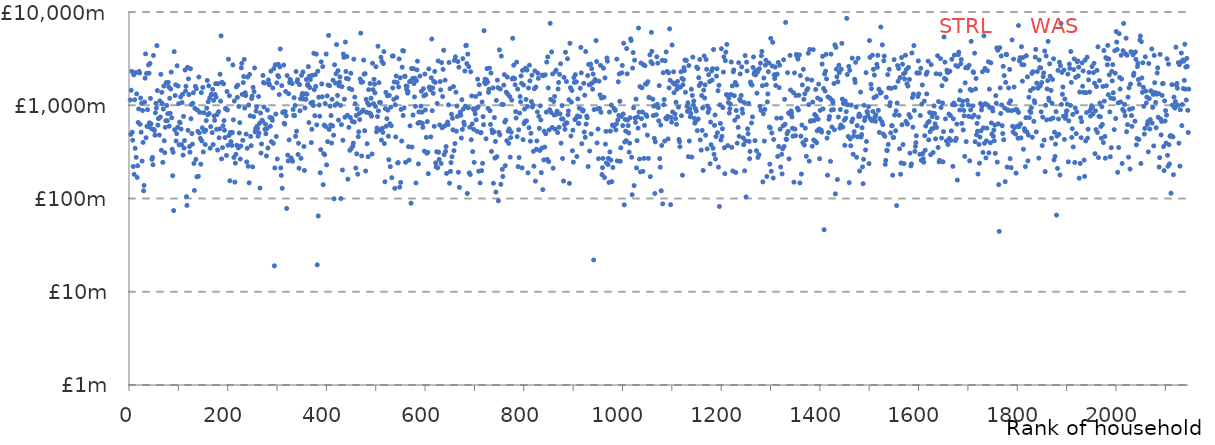
| Category | STRL | WAS |
|---|---|---|
| 0.0 |  | 1138437430.29 |
| 1.0 |  | 488014633.885 |
| 2.0 |  | 1448826612.328 |
| 3.0 |  | 2305919310.573 |
| 4.0 |  | 514027595.297 |
| 5.0 |  | 421928684.106 |
| 6.0 |  | 220240159.911 |
| 7.0 |  | 2116399411.006 |
| 8.0 |  | 181622341.76 |
| 9.0 |  | 1145670837.072 |
| 10.0 |  | 345169902.161 |
| 11.0 |  | 2240864981.197 |
| 12.0 |  | 276567388.786 |
| 13.0 |  | 1325935301.477 |
| 14.0 |  | 168146934.232 |
| 15.0 |  | 224537768.481 |
| 16.0 |  | 653219301.316 |
| 17.0 |  | 913499389.163 |
| 18.0 |  | 2303847512.39 |
| 19.0 |  | 2217212719.335 |
| 20.0 |  | 624051426.238 |
| 21.0 |  | 1192732653.997 |
| 22.0 |  | 513810169.82 |
| 23.0 |  | 1047870891.075 |
| 24.0 |  | 252179571.347 |
| 25.0 |  | 878187423.019 |
| 26.0 |  | 399446822.946 |
| 27.0 |  | 120925428.129 |
| 28.0 |  | 138160874.767 |
| 29.0 |  | 1081704356.472 |
| 30.0 |  | 1952691991.49 |
| 31.0 |  | 3556398857.896 |
| 32.0 |  | 448155769.203 |
| 33.0 |  | 2195711598.5 |
| 34.0 |  | 595310327.949 |
| 35.0 |  | 896296576.971 |
| 36.0 |  | 590604884.512 |
| 37.0 |  | 2706248038.967 |
| 38.0 |  | 2208458869.35 |
| 39.0 |  | 648886711.553 |
| 40.0 |  | 2807338901.922 |
| 41.0 |  | 1184371192.693 |
| 42.0 |  | 630289568.81 |
| 43.0 |  | 559363821.453 |
| 44.0 |  | 262675184.141 |
| 45.0 |  | 275894700.394 |
| 46.0 |  | 230326553.145 |
| 47.0 |  | 3417549013.854 |
| 48.0 |  | 550744215.51 |
| 49.0 |  | 534445831.798 |
| 50.0 |  | 476666595.493 |
| 51.0 |  | 830566759.252 |
| 52.0 |  | 1048224853.004 |
| 53.0 |  | 932991745.357 |
| 54.0 |  | 4364192513.168 |
| 55.0 |  | 1439233717.121 |
| 56.0 |  | 611663312.844 |
| 57.0 |  | 721103057.419 |
| 58.0 |  | 723775554.198 |
| 59.0 |  | 479216681.565 |
| 60.0 |  | 1111629381.253 |
| 61.0 |  | 748116808.675 |
| 62.0 |  | 2146440523.926 |
| 63.0 |  | 329113371.218 |
| 64.0 |  | 1375600072.342 |
| 65.0 |  | 1043769313.125 |
| 66.0 |  | 244071180.721 |
| 67.0 |  | 911268242.576 |
| 68.0 |  | 1606861998.141 |
| 69.0 |  | 416622515.235 |
| 70.0 |  | 309992068.999 |
| 71.0 |  | 579157128.555 |
| 72.0 |  | 681763382.086 |
| 73.0 |  | 1751672372.845 |
| 74.0 |  | 995910166.346 |
| 75.0 |  | 683096596.186 |
| 76.0 |  | 812302875.21 |
| 77.0 |  | 1759127460.007 |
| 78.0 |  | 1575134979.018 |
| 79.0 |  | 596542022.505 |
| 80.0 |  | 1187492341.537 |
| 81.0 |  | 819308674.487 |
| 82.0 |  | 1494839889.771 |
| 83.0 |  | 2268658745.334 |
| 84.0 |  | 733955685.854 |
| 85.0 |  | 337135531.644 |
| 86.0 |  | 175395398.296 |
| 87.0 |  | 312849575.472 |
| 88.0 |  | 74255529.425 |
| 89.0 |  | 3758127083.645 |
| 90.0 |  | 546877584.516 |
| 91.0 |  | 1271004133.935 |
| 92.0 |  | 1657193591.138 |
| 93.0 |  | 414153955.02 |
| 94.0 |  | 495758775.234 |
| 95.0 |  | 2654909426.39 |
| 96.0 |  | 580740136.614 |
| 97.0 |  | 1606807465.726 |
| 98.0 |  | 1040152650.778 |
| 99.0 |  | 375589400.904 |
| 100.0 |  | 659191072.102 |
| 101.0 |  | 648374185.305 |
| 102.0 |  | 1227815704.731 |
| 103.0 |  | 554798227.373 |
| 104.0 |  | 378514457.324 |
| 105.0 |  | 1070044495.781 |
| 106.0 |  | 1308139949.58 |
| 107.0 |  | 291978021.099 |
| 108.0 |  | 760363974.818 |
| 109.0 |  | 347344098.44 |
| 110.0 |  | 418619805.849 |
| 111.0 |  | 2389742231.942 |
| 112.0 |  | 1417070627.277 |
| 113.0 |  | 1595717236.754 |
| 114.0 |  | 104725954.09 |
| 115.0 |  | 84342930.535 |
| 116.0 |  | 2551321487.974 |
| 117.0 |  | 538098193.435 |
| 118.0 |  | 1919087806.201 |
| 119.0 |  | 1301625147.393 |
| 120.0 |  | 360755567.291 |
| 121.0 |  | 313401899.131 |
| 122.0 |  | 2464348930.697 |
| 123.0 |  | 716927251.802 |
| 124.0 |  | 1019745131.776 |
| 125.0 |  | 497119138.143 |
| 126.0 |  | 382482944.289 |
| 127.0 |  | 1049918630.108 |
| 128.0 |  | 1363076971.674 |
| 129.0 |  | 237541056.951 |
| 130.0 |  | 122137371.679 |
| 131.0 |  | 925795305.608 |
| 132.0 |  | 1592642690.865 |
| 133.0 |  | 262539762.338 |
| 134.0 |  | 1506511203.461 |
| 135.0 |  | 170899095.753 |
| 136.0 |  | 888110501.429 |
| 137.0 |  | 524370327.969 |
| 138.0 |  | 172925553.923 |
| 139.0 |  | 2008839369.268 |
| 140.0 |  | 505134724.199 |
| 141.0 |  | 838205679.723 |
| 142.0 |  | 440948987.767 |
| 143.0 |  | 233332875.622 |
| 144.0 |  | 1366750690.579 |
| 145.0 |  | 414548324.486 |
| 146.0 |  | 572454113.102 |
| 147.0 |  | 1553389029.21 |
| 148.0 |  | 315447964.779 |
| 149.0 |  | 832052825.322 |
| 150.0 |  | 526314926.921 |
| 151.0 |  | 523780564.866 |
| 152.0 |  | 379247506.385 |
| 153.0 |  | 539943092.379 |
| 154.0 |  | 684938911.647 |
| 155.0 |  | 930545598.62 |
| 156.0 |  | 1845131001.963 |
| 157.0 |  | 791403373.613 |
| 158.0 |  | 1091190184.977 |
| 159.0 |  | 1617730947.821 |
| 160.0 |  | 815594723.902 |
| 161.0 |  | 1191025606.68 |
| 162.0 |  | 346237408.459 |
| 163.0 |  | 589868879.151 |
| 164.0 |  | 1297779769.673 |
| 165.0 |  | 1303714611.319 |
| 166.0 |  | 508933812.466 |
| 167.0 |  | 1479879268.798 |
| 168.0 |  | 378823401.985 |
| 169.0 |  | 1128596675.29 |
| 170.0 |  | 769256109.741 |
| 171.0 |  | 688949103.304 |
| 172.0 |  | 1303340381.786 |
| 173.0 |  | 1706442813.611 |
| 174.0 |  | 1220430260.851 |
| 175.0 |  | 551622003.265 |
| 176.0 |  | 795986857.087 |
| 177.0 |  | 330900792.573 |
| 178.0 |  | 1705604445.92 |
| 179.0 |  | 852586503.948 |
| 180.0 |  | 447821535.824 |
| 181.0 |  | 557128849.355 |
| 182.0 |  | 2150073274.986 |
| 183.0 |  | 1105476453.23 |
| 184.0 |  | 5545576622.435 |
| 185.0 |  | 265826941.658 |
| 186.0 |  | 1763883800.808 |
| 187.0 |  | 351275963.177 |
| 188.0 |  | 602619669.832 |
| 189.0 |  | 1695538524.998 |
| 190.0 |  | 684836881.617 |
| 191.0 |  | 538499092.554 |
| 192.0 |  | 450048980.621 |
| 193.0 |  | 924659850.927 |
| 194.0 |  | 912589577.516 |
| 195.0 |  | 289451438.776 |
| 196.0 |  | 1405290880.67 |
| 197.0 |  | 889933667.735 |
| 198.0 |  | 372758833.301 |
| 199.0 |  | 3120704275.519 |
| 200.0 |  | 473458040.443 |
| 201.0 |  | 1265174526.87 |
| 202.0 |  | 155091895.978 |
| 203.0 |  | 512274022.525 |
| 204.0 |  | 407630710.001 |
| 205.0 |  | 503470002.201 |
| 206.0 |  | 370722695.265 |
| 207.0 |  | 511996004.359 |
| 208.0 |  | 2705091401.548 |
| 209.0 |  | 698486449.514 |
| 210.0 |  | 275481771.666 |
| 211.0 |  | 1110987160.248 |
| 212.0 |  | 149735725.223 |
| 213.0 |  | 239282824.725 |
| 214.0 |  | 297582717.093 |
| 215.0 |  | 1573025328 |
| 216.0 |  | 371534621.878 |
| 217.0 |  | 1215611899.604 |
| 218.0 |  | 1643906768.108 |
| 219.0 |  | 348736540.545 |
| 220.0 |  | 969412428.318 |
| 221.0 |  | 503916412.048 |
| 222.0 |  | 651024718.411 |
| 223.0 |  | 265089365.895 |
| 224.0 |  | 365341327.245 |
| 225.0 |  | 2519180447.558 |
| 226.0 |  | 2813866328.629 |
| 227.0 |  | 1306719056.129 |
| 228.0 |  | 420370767.779 |
| 229.0 |  | 1750090763.596 |
| 230.0 |  | 2034549552.402 |
| 231.0 |  | 3102918578.519 |
| 232.0 |  | 933400606.541 |
| 233.0 |  | 1364859246.092 |
| 234.0 |  | 1270235395.307 |
| 235.0 |  | 490483972.656 |
| 236.0 |  | 246930655.24 |
| 237.0 |  | 345576588.818 |
| 238.0 |  | 2006611413.877 |
| 239.0 |  | 221455714.331 |
| 240.0 |  | 1005235750.383 |
| 241.0 |  | 147211742.034 |
| 242.0 |  | 2139719647.936 |
| 243.0 |  | 771090799.996 |
| 244.0 |  | 463041894.075 |
| 245.0 |  | 368419267.655 |
| 246.0 |  | 1181619845.982 |
| 247.0 |  | 1252559517.584 |
| 248.0 |  | 218555203.741 |
| 249.0 |  | 1555828366.483 |
| 250.0 |  | 755556313.663 |
| 251.0 |  | 1399210047.883 |
| 252.0 |  | 2512935231.774 |
| 253.0 |  | 517934765.989 |
| 254.0 |  | 563320111.487 |
| 255.0 |  | 864853975.889 |
| 256.0 |  | 962403200.243 |
| 257.0 |  | 594975396.466 |
| 258.0 |  | 561768161.435 |
| 259.0 |  | 465107829.687 |
| 260.0 |  | 1241656585.789 |
| 261.0 |  | 503660567.001 |
| 262.0 |  | 640057584.442 |
| 263.0 |  | 129425214.671 |
| 264.0 |  | 825073032.472 |
| 265.0 |  | 307064837.862 |
| 266.0 |  | 384530173.07 |
| 267.0 |  | 690188076.996 |
| 268.0 |  | 675175231.847 |
| 269.0 |  | 2087810112.025 |
| 270.0 |  | 1754203347.758 |
| 271.0 |  | 957435710.339 |
| 272.0 |  | 1727229212.092 |
| 273.0 |  | 551294127.036 |
| 274.0 |  | 625261008.025 |
| 275.0 |  | 494660777.879 |
| 276.0 |  | 286272159.666 |
| 277.0 |  | 562105982.397 |
| 278.0 |  | 887488121.568 |
| 279.0 |  | 347762653.452 |
| 280.0 |  | 1867965108.353 |
| 281.0 |  | 1701203212.213 |
| 282.0 |  | 1656160384.522 |
| 283.0 |  | 741245964.42 |
| 284.0 |  | 595519709.181 |
| 285.0 |  | 2319126830.187 |
| 286.0 |  | 407578808.6 |
| 287.0 |  | 730774379.306 |
| 288.0 |  | 689107296.025 |
| 289.0 |  | 1536995087.043 |
| 290.0 |  | 390267882.267 |
| 291.0 |  | 2473495995.187 |
| 292.0 |  | 18980394.932 |
| 293.0 |  | 212646322.332 |
| 294.0 |  | 2717242929.839 |
| 295.0 |  | 804781135.61 |
| 296.0 |  | 462651928.008 |
| 297.0 |  | 1740504090.078 |
| 298.0 |  | 265410821.615 |
| 299.0 |  | 2083880598.943 |
| 300.0 |  | 2749282230.511 |
| 301.0 |  | 2016722088.267 |
| 302.0 |  | 1302428826.274 |
| 303.0 |  | 2576137736.545 |
| 304.0 |  | 4014943528.814 |
| 305.0 |  | 212867559.763 |
| 306.0 |  | 176875568.204 |
| 307.0 |  | 1623051321.027 |
| 308.0 |  | 128511890.254 |
| 309.0 |  | 835945189.184 |
| 310.0 |  | 850137457.335 |
| 311.0 |  | 2697121400.895 |
| 312.0 |  | 640653926.793 |
| 313.0 |  | 627643126.567 |
| 314.0 |  | 855735106.461 |
| 315.0 |  | 1402973240.084 |
| 316.0 |  | 770473623.824 |
| 317.0 |  | 78230712.625 |
| 318.0 |  | 2082847139.005 |
| 319.0 |  | 291966961.333 |
| 320.0 |  | 252792761.193 |
| 321.0 |  | 1329858912.326 |
| 322.0 |  | 425108680.595 |
| 323.0 |  | 1747714221.392 |
| 324.0 |  | 1893257995.345 |
| 325.0 |  | 1836208624.227 |
| 326.0 |  | 272870195.243 |
| 327.0 |  | 262396710.857 |
| 328.0 |  | 1706997047.635 |
| 329.0 |  | 250282881.153 |
| 330.0 |  | 899976275.467 |
| 331.0 |  | 779047637.388 |
| 332.0 |  | 1204744153.631 |
| 333.0 |  | 773087617.46 |
| 334.0 |  | 994621417.142 |
| 335.0 |  | 464698318.014 |
| 336.0 |  | 2297789720.032 |
| 337.0 |  | 525799823.63 |
| 338.0 |  | 1787420456.739 |
| 339.0 |  | 1882630546.261 |
| 340.0 |  | 296531771.629 |
| 341.0 |  | 391338344.905 |
| 342.0 |  | 211293218.196 |
| 343.0 |  | 1666529556.901 |
| 344.0 |  | 872450694.242 |
| 345.0 |  | 1172874196.24 |
| 346.0 |  | 269467341.468 |
| 347.0 |  | 2094058412.923 |
| 348.0 |  | 1269986334.062 |
| 349.0 |  | 1339359049.318 |
| 350.0 |  | 2276886860.437 |
| 351.0 |  | 1166661303.005 |
| 352.0 |  | 360896949.489 |
| 353.0 |  | 199828063.024 |
| 354.0 |  | 936020368.844 |
| 355.0 |  | 1325262785.398 |
| 356.0 |  | 1158273355.363 |
| 357.0 |  | 1888388200.324 |
| 358.0 |  | 1313450576.692 |
| 359.0 |  | 1635311652.043 |
| 360.0 |  | 1676455177.06 |
| 361.0 |  | 2595449176.708 |
| 362.0 |  | 652339994.768 |
| 363.0 |  | 2051289346.467 |
| 364.0 |  | 1548098020.897 |
| 365.0 |  | 1881204572.69 |
| 366.0 |  | 1058046489.923 |
| 367.0 |  | 397717502.434 |
| 368.0 |  | 551631439.058 |
| 369.0 |  | 2093122626.747 |
| 370.0 |  | 1079721538.695 |
| 371.0 |  | 994160777.299 |
| 372.0 |  | 3605364936.622 |
| 373.0 |  | 1467745294.208 |
| 374.0 |  | 771996027.44 |
| 375.0 |  | 2129789481.546 |
| 376.0 |  | 1591368678.289 |
| 377.0 |  | 3530035600.9 |
| 378.0 |  | 616388122.245 |
| 379.0 |  | 19428149.023 |
| 380.0 |  | 2322369678.076 |
| 381.0 |  | 64964569.711 |
| 382.0 |  | 1219225868.28 |
| 383.0 |  | 1005141125.234 |
| 384.0 |  | 762755525.868 |
| 385.0 |  | 189058645.772 |
| 386.0 |  | 334497212.351 |
| 387.0 |  | 2924362788.829 |
| 388.0 |  | 1693481277.325 |
| 389.0 |  | 1231607392.895 |
| 390.0 |  | 2595243982.922 |
| 391.0 |  | 140737635.44 |
| 392.0 |  | 302812270.498 |
| 393.0 |  | 612159331.6 |
| 394.0 |  | 294822080.985 |
| 395.0 |  | 1044132073.289 |
| 396.0 |  | 591641350.121 |
| 397.0 |  | 3542271398.444 |
| 398.0 |  | 229433684.939 |
| 399.0 |  | 1258550590.922 |
| 400.0 |  | 406979809.217 |
| 401.0 |  | 1647366188.744 |
| 402.0 |  | 5613268210.564 |
| 403.0 |  | 551141295.252 |
| 404.0 |  | 1622223334.23 |
| 405.0 |  | 978773735.173 |
| 406.0 |  | 613614322.396 |
| 407.0 |  | 775383704.506 |
| 408.0 |  | 393186414.539 |
| 409.0 |  | 1157777465.437 |
| 410.0 |  | 600942555.571 |
| 411.0 |  | 1853894285.206 |
| 412.0 |  | 477632618.684 |
| 413.0 |  | 99363827.1 |
| 414.0 |  | 2717535039.909 |
| 415.0 |  | 999404987.741 |
| 416.0 |  | 1725785105.478 |
| 417.0 |  | 2178570727.415 |
| 418.0 |  | 4481467351.714 |
| 419.0 |  | 1040164370.584 |
| 420.0 |  | 1273090511.771 |
| 421.0 |  | 2346764917.405 |
| 422.0 |  | 693325878.686 |
| 423.0 |  | 1618329766.303 |
| 424.0 |  | 1767218336.818 |
| 425.0 |  | 2012131438.522 |
| 426.0 |  | 996969541.745 |
| 427.0 |  | 99858415.17 |
| 428.0 |  | 619759966.797 |
| 429.0 |  | 1580646237.813 |
| 430.0 |  | 202180294.395 |
| 431.0 |  | 421122999.58 |
| 432.0 |  | 3537420434.625 |
| 433.0 |  | 3262978765.721 |
| 434.0 |  | 1162031730.961 |
| 435.0 |  | 743891538.055 |
| 436.0 |  | 4763337060.075 |
| 437.0 |  | 2302761902.071 |
| 438.0 |  | 1941430869.463 |
| 439.0 |  | 3331077387.368 |
| 440.0 |  | 781889133.951 |
| 441.0 |  | 161103437.97 |
| 442.0 |  | 1913137597.116 |
| 443.0 |  | 579217424.279 |
| 444.0 |  | 1514317817.456 |
| 445.0 |  | 328427408.803 |
| 446.0 |  | 738622212.822 |
| 447.0 |  | 2203353249.627 |
| 448.0 |  | 342397528.373 |
| 449.0 |  | 1472507043.735 |
| 450.0 |  | 671615647.137 |
| 451.0 |  | 363566708.679 |
| 452.0 |  | 392648007.838 |
| 453.0 |  | 3121755734.561 |
| 454.0 |  | 659417700.972 |
| 455.0 |  | 1222647161.44 |
| 456.0 |  | 1039039470.28 |
| 457.0 |  | 212195688.618 |
| 458.0 |  | 776820467.621 |
| 459.0 |  | 301341217.592 |
| 460.0 |  | 915579544.298 |
| 461.0 |  | 182036794.279 |
| 462.0 |  | 459974036.904 |
| 463.0 |  | 519234414.42 |
| 464.0 |  | 816465183.924 |
| 465.0 |  | 702567636.451 |
| 466.0 |  | 1913618426.561 |
| 467.0 |  | 5938151515.826 |
| 468.0 |  | 1762233568.392 |
| 469.0 |  | 285839644.118 |
| 470.0 |  | 854304214.462 |
| 471.0 |  | 1778345630.349 |
| 472.0 |  | 889092088.113 |
| 473.0 |  | 3048472399.06 |
| 474.0 |  | 2155999354.292 |
| 475.0 |  | 533464437.212 |
| 476.0 |  | 2181026273.169 |
| 477.0 |  | 197008195.604 |
| 478.0 |  | 1156338061.913 |
| 479.0 |  | 838179745.578 |
| 480.0 |  | 386975416.75 |
| 481.0 |  | 1059509651.819 |
| 482.0 |  | 280926717.282 |
| 483.0 |  | 1471179321.067 |
| 484.0 |  | 1007199993.62 |
| 485.0 |  | 824525474.166 |
| 486.0 |  | 1711305163.296 |
| 487.0 |  | 807709325.526 |
| 488.0 |  | 1188632395.841 |
| 489.0 |  | 764205280.74 |
| 490.0 |  | 300211531.891 |
| 491.0 |  | 2818099528.84 |
| 492.0 |  | 1470412172.337 |
| 493.0 |  | 1041331938.211 |
| 494.0 |  | 1897281014.141 |
| 495.0 |  | 1679569176.093 |
| 496.0 |  | 1355482200.954 |
| 497.0 |  | 972391420.685 |
| 498.0 |  | 2587430249.232 |
| 499.0 |  | 519203791.381 |
| 500.0 |  | 570104418.044 |
| 501.0 |  | 755988662.02 |
| 502.0 |  | 4296498863.039 |
| 503.0 |  | 869834391.193 |
| 504.0 |  | 1746990419.702 |
| 505.0 |  | 1071101763.953 |
| 506.0 |  | 542999366.506 |
| 507.0 |  | 1072568829.131 |
| 508.0 |  | 3269460910.981 |
| 509.0 |  | 423217191.893 |
| 510.0 |  | 2953197825.129 |
| 511.0 |  | 566583696.406 |
| 512.0 |  | 510721326.092 |
| 513.0 |  | 2802198476.986 |
| 514.0 |  | 3762477407.6 |
| 515.0 |  | 388143121.653 |
| 516.0 |  | 151223720.587 |
| 517.0 |  | 919624415.43 |
| 518.0 |  | 1374181367.069 |
| 519.0 |  | 596360681.96 |
| 520.0 |  | 718931269.754 |
| 521.0 |  | 1262062129.371 |
| 522.0 |  | 885977079.619 |
| 523.0 |  | 465692456.148 |
| 524.0 |  | 260445080.28 |
| 525.0 |  | 1274460767.427 |
| 526.0 |  | 633746114.981 |
| 527.0 |  | 219738378.27 |
| 528.0 |  | 954901114.12 |
| 529.0 |  | 603338979.73 |
| 530.0 |  | 167224131.423 |
| 531.0 |  | 3364500011.542 |
| 532.0 |  | 1532821942.644 |
| 533.0 |  | 3380321644.728 |
| 534.0 |  | 1157583881.815 |
| 535.0 |  | 1779175454.522 |
| 536.0 |  | 128538008.92 |
| 537.0 |  | 1011801477.219 |
| 538.0 |  | 457164827.567 |
| 539.0 |  | 2059028820.249 |
| 540.0 |  | 1210023656.137 |
| 541.0 |  | 1752510651.695 |
| 542.0 |  | 240051667.494 |
| 543.0 |  | 242763473.283 |
| 544.0 |  | 1570457576.569 |
| 545.0 |  | 3137083690.77 |
| 546.0 |  | 132277867.924 |
| 547.0 |  | 1969109618.245 |
| 548.0 |  | 148757076.481 |
| 549.0 |  | 902471459.316 |
| 550.0 |  | 413660682.361 |
| 551.0 |  | 2555379165.714 |
| 552.0 |  | 3856581829.787 |
| 553.0 |  | 776032339.349 |
| 554.0 |  | 3813894194.995 |
| 555.0 |  | 938533935.35 |
| 556.0 |  | 2047971160.462 |
| 557.0 |  | 2040465136.029 |
| 558.0 |  | 244337471.002 |
| 559.0 |  | 1609610404.827 |
| 560.0 |  | 1475753577.614 |
| 561.0 |  | 1595059023.51 |
| 562.0 |  | 1349708476.4 |
| 563.0 |  | 1399886969.356 |
| 564.0 |  | 359707959.164 |
| 565.0 |  | 258057299.665 |
| 566.0 |  | 1794864840.004 |
| 567.0 |  | 602104775.075 |
| 568.0 |  | 1804229029.367 |
| 569.0 |  | 89047493.101 |
| 570.0 |  | 2478484726.203 |
| 571.0 |  | 355984041.697 |
| 572.0 |  | 1933796604.768 |
| 573.0 |  | 785390207.086 |
| 574.0 |  | 2470664265.847 |
| 575.0 |  | 1708583814.567 |
| 576.0 |  | 1228932513.565 |
| 577.0 |  | 1946070966.972 |
| 578.0 |  | 974197317.582 |
| 579.0 |  | 146654501.579 |
| 580.0 |  | 1836440192.898 |
| 581.0 |  | 2394213268.373 |
| 582.0 |  | 2969036209.286 |
| 583.0 |  | 641043733.191 |
| 584.0 |  | 235326125.279 |
| 585.0 |  | 846853440.355 |
| 586.0 |  | 654912940.943 |
| 587.0 |  | 2054329603.899 |
| 588.0 |  | 652010742.637 |
| 589.0 |  | 977160694.098 |
| 590.0 |  | 1413414174.263 |
| 591.0 |  | 842638706.272 |
| 592.0 |  | 638644776.605 |
| 593.0 |  | 579837299.205 |
| 594.0 |  | 1505182182.399 |
| 595.0 |  | 1260530847.974 |
| 596.0 |  | 321821996.788 |
| 597.0 |  | 2159746582.747 |
| 598.0 |  | 890537718.865 |
| 599.0 |  | 1298201015.714 |
| 600.0 |  | 452162815.465 |
| 601.0 |  | 305895965.61 |
| 602.0 |  | 668430008.27 |
| 603.0 |  | 313015132.083 |
| 604.0 |  | 184520253.352 |
| 605.0 |  | 2454316552.96 |
| 606.0 |  | 1560062816.326 |
| 607.0 |  | 1564452856.661 |
| 608.0 |  | 1466238647.327 |
| 609.0 |  | 458301740.602 |
| 610.0 |  | 1971074663.09 |
| 611.0 |  | 5134859815.204 |
| 612.0 |  | 875058539.723 |
| 613.0 |  | 1532175436.392 |
| 614.0 |  | 1341321317.913 |
| 615.0 |  | 1805082234.749 |
| 616.0 |  | 594341571.454 |
| 617.0 |  | 2304328933.653 |
| 618.0 |  | 1754755617.316 |
| 619.0 |  | 241255327.174 |
| 620.0 |  | 217991635.057 |
| 621.0 |  | 317233522.381 |
| 622.0 |  | 1045794366.405 |
| 623.0 |  | 213537834.517 |
| 624.0 |  | 2986799633.687 |
| 625.0 |  | 313497966.453 |
| 626.0 |  | 262324267.167 |
| 627.0 |  | 614982446.851 |
| 628.0 |  | 1795229445.553 |
| 629.0 |  | 1462949901.116 |
| 630.0 |  | 237621657.918 |
| 631.0 |  | 2863491850.97 |
| 632.0 |  | 573099846.391 |
| 633.0 |  | 1239290449.143 |
| 634.0 |  | 2422720062.22 |
| 635.0 |  | 3888345505.732 |
| 636.0 |  | 295240739.097 |
| 637.0 |  | 597929743.376 |
| 638.0 |  | 1858962996.818 |
| 639.0 |  | 320023243.069 |
| 640.0 |  | 360537933.572 |
| 641.0 |  | 185752274.328 |
| 642.0 |  | 626096031.585 |
| 643.0 |  | 660406070.316 |
| 644.0 |  | 620318691.785 |
| 645.0 |  | 1010365169.142 |
| 646.0 |  | 2877700333.105 |
| 647.0 |  | 145922488.008 |
| 648.0 |  | 1507304108.12 |
| 649.0 |  | 195244907.336 |
| 650.0 |  | 242759367.468 |
| 651.0 |  | 800347059.077 |
| 652.0 |  | 280806747.591 |
| 653.0 |  | 723885545.791 |
| 654.0 |  | 545506795.849 |
| 655.0 |  | 1585817898.862 |
| 656.0 |  | 326258762.013 |
| 657.0 |  | 3032059013.434 |
| 658.0 |  | 388672520.152 |
| 659.0 |  | 3306236789.79 |
| 660.0 |  | 1381783744.691 |
| 661.0 |  | 526763925.481 |
| 662.0 |  | 981666065.267 |
| 663.0 |  | 758021677.124 |
| 664.0 |  | 2940362371.156 |
| 665.0 |  | 191304100.048 |
| 666.0 |  | 2560945613.313 |
| 667.0 |  | 131461311.799 |
| 668.0 |  | 794222760.546 |
| 669.0 |  | 846545966.357 |
| 670.0 |  | 781571671.188 |
| 671.0 |  | 444874399.271 |
| 672.0 |  | 1146681075.161 |
| 673.0 |  | 551271928.571 |
| 674.0 |  | 3163063052.758 |
| 675.0 |  | 910821028.558 |
| 676.0 |  | 658377423.255 |
| 677.0 |  | 617146047.421 |
| 678.0 |  | 2326366760.432 |
| 679.0 |  | 976086204.007 |
| 680.0 |  | 4353081075.554 |
| 681.0 |  | 4393624731.323 |
| 682.0 |  | 2797019360.07 |
| 683.0 |  | 113267303.313 |
| 684.0 |  | 3534045476.317 |
| 685.0 |  | 938062110.295 |
| 686.0 |  | 2593281464.262 |
| 687.0 |  | 188373474.383 |
| 688.0 |  | 580850601.035 |
| 689.0 |  | 180885637.805 |
| 690.0 |  | 2286673409.729 |
| 691.0 |  | 426684126.843 |
| 692.0 |  | 1259418669.986 |
| 693.0 |  | 630677994.664 |
| 694.0 |  | 318605058.049 |
| 695.0 |  | 915912464.197 |
| 696.0 |  | 551954834.547 |
| 697.0 |  | 243993513.396 |
| 698.0 |  | 875207478.434 |
| 699.0 |  | 809971565.675 |
| 700.0 |  | 1241274974.355 |
| 701.0 |  | 697349919.745 |
| 702.0 |  | 929566323.764 |
| 703.0 |  | 524355152.822 |
| 704.0 |  | 1903348969.348 |
| 705.0 |  | 958243248.757 |
| 706.0 |  | 196168415.007 |
| 707.0 |  | 1657805256.159 |
| 708.0 |  | 1328267305.046 |
| 709.0 |  | 146749488.87 |
| 710.0 |  | 507022904.065 |
| 711.0 |  | 509156588.094 |
| 712.0 |  | 198958325.097 |
| 713.0 |  | 1083501967.14 |
| 714.0 |  | 238454467.884 |
| 715.0 |  | 754840302.353 |
| 716.0 |  | 619356269.874 |
| 717.0 |  | 6305046317.518 |
| 718.0 |  | 1762131957.324 |
| 719.0 |  | 1900273840.15 |
| 720.0 |  | 1701451482.376 |
| 721.0 |  | 436839347.214 |
| 722.0 |  | 1868561182.875 |
| 723.0 |  | 2474158084.215 |
| 724.0 |  | 1771526445.083 |
| 725.0 |  | 927495449.99 |
| 726.0 |  | 1377240211.71 |
| 727.0 |  | 1484198052.63 |
| 728.0 |  | 2502417701.506 |
| 729.0 |  | 872458843.77 |
| 730.0 |  | 622739920.203 |
| 731.0 |  | 2215233348.98 |
| 732.0 |  | 319608930.704 |
| 733.0 |  | 543576272.86 |
| 734.0 |  | 507666036.197 |
| 735.0 |  | 1537258829.403 |
| 736.0 |  | 145617267.787 |
| 737.0 |  | 518646574.659 |
| 738.0 |  | 737653897.393 |
| 739.0 |  | 271359690.603 |
| 740.0 |  | 409043417.071 |
| 741.0 |  | 117229906.104 |
| 742.0 |  | 1127009842.926 |
| 743.0 |  | 280790609.097 |
| 744.0 |  | 1859184365.608 |
| 745.0 |  | 1542997374.927 |
| 746.0 |  | 94527049.675 |
| 747.0 |  | 512031294.275 |
| 748.0 |  | 3923918011.139 |
| 749.0 |  | 481687417.934 |
| 750.0 |  | 1493691667.87 |
| 751.0 |  | 141926041.133 |
| 752.0 |  | 3359942717.542 |
| 753.0 |  | 1020744690.793 |
| 754.0 |  | 205694342.306 |
| 755.0 |  | 172109564.401 |
| 756.0 |  | 1017796978.941 |
| 757.0 |  | 1643902324.995 |
| 758.0 |  | 2131023728.117 |
| 759.0 |  | 660442519.038 |
| 760.0 |  | 225037945.872 |
| 761.0 |  | 691716465.676 |
| 762.0 |  | 1380289969.158 |
| 763.0 |  | 416283599.207 |
| 764.0 |  | 2007386593.515 |
| 765.0 |  | 1317599174.506 |
| 766.0 |  | 528176308.805 |
| 767.0 |  | 390081837.682 |
| 768.0 |  | 556384348.575 |
| 769.0 |  | 1240659920.622 |
| 770.0 |  | 277862271.291 |
| 771.0 |  | 449829737.879 |
| 772.0 |  | 514074307.885 |
| 773.0 |  | 1135963819.934 |
| 774.0 |  | 1913735043.521 |
| 775.0 |  | 5225867575.798 |
| 776.0 |  | 1964447848.539 |
| 777.0 |  | 2688729670.484 |
| 778.0 |  | 1922327169.805 |
| 779.0 |  | 1929452878.988 |
| 780.0 |  | 1658238251.074 |
| 781.0 |  | 855018759.624 |
| 782.0 |  | 729016498.803 |
| 783.0 |  | 2893323095.782 |
| 784.0 |  | 460785443.721 |
| 785.0 |  | 1489745220.554 |
| 786.0 |  | 219512192.298 |
| 787.0 |  | 545855692.897 |
| 788.0 |  | 274747202.087 |
| 789.0 |  | 823243941.041 |
| 790.0 |  | 1240648791.508 |
| 791.0 |  | 1086940420.716 |
| 792.0 |  | 2064073477.886 |
| 793.0 |  | 1721001313.985 |
| 794.0 |  | 212803399.194 |
| 795.0 |  | 2362526467.185 |
| 796.0 |  | 427060520.46 |
| 797.0 |  | 1644348720.276 |
| 798.0 |  | 636208064.103 |
| 799.0 |  | 908726574.344 |
| 800.0 |  | 670526782.234 |
| 801.0 |  | 2498536282.674 |
| 802.0 |  | 1154792981.44 |
| 803.0 |  | 680601962.737 |
| 804.0 |  | 2382077070.438 |
| 805.0 |  | 970592255.743 |
| 806.0 |  | 188392503.108 |
| 807.0 |  | 1531079765.215 |
| 808.0 |  | 574652123.594 |
| 809.0 |  | 2684317875.973 |
| 810.0 |  | 1826888680.052 |
| 811.0 |  | 411672367.734 |
| 812.0 |  | 500692579.627 |
| 813.0 |  | 1094802238.692 |
| 814.0 |  | 2098422278.846 |
| 815.0 |  | 957797070.707 |
| 816.0 |  | 1003863808.108 |
| 817.0 |  | 320686793.301 |
| 818.0 |  | 221859030.359 |
| 819.0 |  | 1505208079.454 |
| 820.0 |  | 2335197542.507 |
| 821.0 |  | 153474733.786 |
| 822.0 |  | 1570573815.923 |
| 823.0 |  | 337258720.735 |
| 824.0 |  | 414419825.246 |
| 825.0 |  | 848129317.449 |
| 826.0 |  | 2206557004.19 |
| 827.0 |  | 1943589413.337 |
| 828.0 |  | 760189079.207 |
| 829.0 |  | 564748738.069 |
| 830.0 |  | 326861468.036 |
| 831.0 |  | 986585237.851 |
| 832.0 |  | 694838871.184 |
| 833.0 |  | 189705549.599 |
| 834.0 |  | 346397201.321 |
| 835.0 |  | 2106403904.81 |
| 836.0 |  | 124597220.431 |
| 837.0 |  | 2074631729.121 |
| 838.0 |  | 259332583.164 |
| 839.0 |  | 527248788.936 |
| 840.0 |  | 355807699.453 |
| 841.0 |  | 2119399872.926 |
| 842.0 |  | 494931557.255 |
| 843.0 |  | 842208211.856 |
| 844.0 |  | 2902223787.443 |
| 845.0 |  | 262892883.437 |
| 846.0 |  | 3306699392.824 |
| 847.0 |  | 1532899635.176 |
| 848.0 |  | 248845061.198 |
| 849.0 |  | 543465243.987 |
| 850.0 |  | 894350052.761 |
| 851.0 |  | 7565837653.969 |
| 852.0 |  | 1154346591.953 |
| 853.0 |  | 837606048.209 |
| 854.0 |  | 3731282686.496 |
| 855.0 |  | 576992027.742 |
| 856.0 |  | 2167210768.763 |
| 857.0 |  | 211143758.47 |
| 858.0 |  | 1099132497.833 |
| 859.0 |  | 785702357.659 |
| 860.0 |  | 1243844964.72 |
| 861.0 |  | 553198624.545 |
| 862.0 |  | 2304760969.306 |
| 863.0 |  | 2375950678.633 |
| 864.0 |  | 801047115.708 |
| 865.0 |  | 864002510.948 |
| 866.0 |  | 509291777.085 |
| 867.0 |  | 1495239439.772 |
| 868.0 |  | 1756035106.589 |
| 869.0 |  | 580774817.798 |
| 870.0 |  | 2141375204.889 |
| 871.0 |  | 809606755.323 |
| 872.0 |  | 2789638379.115 |
| 873.0 |  | 392239773.201 |
| 874.0 |  | 714340965.327 |
| 875.0 |  | 992574103.303 |
| 876.0 |  | 268310098.595 |
| 877.0 |  | 713201319.68 |
| 878.0 |  | 153930176.406 |
| 879.0 |  | 1988371020.457 |
| 880.0 |  | 617879217.216 |
| 881.0 |  | 551662461.57 |
| 882.0 |  | 3699620495.108 |
| 883.0 |  | 645209735.257 |
| 884.0 |  | 1794983717.637 |
| 885.0 |  | 646144069.5 |
| 886.0 |  | 3155125434.271 |
| 887.0 |  | 790061535.92 |
| 888.0 |  | 868424171.719 |
| 889.0 |  | 1144442155.229 |
| 890.0 |  | 145420244.894 |
| 891.0 |  | 4617482510.941 |
| 892.0 |  | 1544299664.81 |
| 893.0 |  | 467831682.363 |
| 894.0 |  | 1077826017.219 |
| 895.0 |  | 1440295590.195 |
| 896.0 |  | 325056697.292 |
| 897.0 |  | 539910412.907 |
| 898.0 |  | 245531558.005 |
| 899.0 |  | 1980347620.189 |
| 900.0 |  | 1756120102.27 |
| 901.0 |  | 701105582.127 |
| 902.0 |  | 2127952407.446 |
| 903.0 |  | 720335679.167 |
| 904.0 |  | 1782422001.43 |
| 905.0 |  | 282260191.142 |
| 906.0 |  | 767291138.311 |
| 907.0 |  | 1169071198.95 |
| 908.0 |  | 639876710.852 |
| 909.0 |  | 637880986.469 |
| 910.0 |  | 930540314.252 |
| 911.0 |  | 754809606.394 |
| 912.0 |  | 1522402698.025 |
| 913.0 |  | 4169322585.182 |
| 914.0 |  | 2225097011.593 |
| 915.0 |  | 387035782.463 |
| 916.0 |  | 897068316.111 |
| 917.0 |  | 863685283.694 |
| 918.0 |  | 881129550.665 |
| 919.0 |  | 1719956346.87 |
| 920.0 |  | 516415273.934 |
| 921.0 |  | 1281674487.546 |
| 922.0 |  | 452924491.05 |
| 923.0 |  | 3767820509.475 |
| 924.0 |  | 627783436.309 |
| 925.0 |  | 765624691.122 |
| 926.0 |  | 734188114.511 |
| 927.0 |  | 2082387911.609 |
| 928.0 |  | 220263310.706 |
| 929.0 |  | 2738308315.209 |
| 930.0 |  | 1655209290.483 |
| 931.0 |  | 323055431.955 |
| 932.0 |  | 1663030150.019 |
| 933.0 |  | 2757072224.121 |
| 934.0 |  | 492492493.043 |
| 935.0 |  | 2468238817.777 |
| 936.0 |  | 1734371789.147 |
| 937.0 |  | 1486671204.218 |
| 938.0 |  | 2160594052.169 |
| 939.0 |  | 21945785.649 |
| 940.0 |  | 898695073.89 |
| 941.0 |  | 1821508223.436 |
| 942.0 |  | 1888204287.188 |
| 943.0 |  | 1833327709.235 |
| 944.0 |  | 4936468581.255 |
| 945.0 |  | 2942507398.835 |
| 946.0 |  | 394692433.348 |
| 947.0 |  | 914874251.636 |
| 948.0 |  | 555864900.048 |
| 949.0 |  | 267559668.41 |
| 950.0 |  | 1813926713.94 |
| 951.0 |  | 923129200.368 |
| 952.0 |  | 1292550673.983 |
| 953.0 |  | 2675803976.561 |
| 954.0 |  | 840155949.783 |
| 955.0 |  | 1194405512.966 |
| 956.0 |  | 180709671.453 |
| 957.0 |  | 214321476.81 |
| 958.0 |  | 268594916.199 |
| 959.0 |  | 2499089742.656 |
| 960.0 |  | 1217346338.09 |
| 961.0 |  | 167895474.803 |
| 962.0 |  | 1963424922.317 |
| 963.0 |  | 382545062.975 |
| 964.0 |  | 524713395.493 |
| 965.0 |  | 240778282.753 |
| 966.0 |  | 3211943856.847 |
| 967.0 |  | 2967522503.175 |
| 968.0 |  | 231589815.247 |
| 969.0 |  | 268933240.379 |
| 970.0 |  | 148547007.637 |
| 971.0 |  | 845628663.928 |
| 972.0 |  | 315594540.58 |
| 973.0 |  | 527733206.47 |
| 974.0 |  | 258217145.678 |
| 975.0 |  | 1004549920.493 |
| 976.0 |  | 151741180.252 |
| 977.0 |  | 612972172.542 |
| 978.0 |  | 214869058.647 |
| 979.0 |  | 598224368.644 |
| 980.0 |  | 926702730.625 |
| 981.0 |  | 609067942.715 |
| 982.0 |  | 899646229.684 |
| 983.0 |  | 882076683.116 |
| 984.0 |  | 543509801.963 |
| 985.0 |  | 629935969.06 |
| 986.0 |  | 3119545253.03 |
| 987.0 |  | 252904311.461 |
| 988.0 |  | 695606429.146 |
| 989.0 |  | 1784613878.639 |
| 990.0 |  | 778512802.502 |
| 991.0 |  | 2168454262.6 |
| 992.0 |  | 1103350798.696 |
| 993.0 |  | 250471203.237 |
| 994.0 |  | 349824675.471 |
| 995.0 |  | 757573973.395 |
| 996.0 |  | 2223965778.685 |
| 997.0 |  | 2668644055.134 |
| 998.0 |  | 605554328.462 |
| 999.0 |  | 805954171.598 |
| 1000.0 |  | 4621805700.606 |
| 1001.0 |  | 85552477.987 |
| 1002.0 |  | 403744156.883 |
| 1003.0 |  | 704857945.787 |
| 1004.0 |  | 528257560.453 |
| 1005.0 |  | 416939652.31 |
| 1006.0 |  | 4055870329.861 |
| 1007.0 |  | 2172763875.974 |
| 1008.0 |  | 693910859.836 |
| 1009.0 |  | 604974801.987 |
| 1010.0 |  | 504286760.927 |
| 1011.0 |  | 314528723.887 |
| 1012.0 |  | 391723324.996 |
| 1013.0 |  | 735836029.361 |
| 1014.0 |  | 5153316787.57 |
| 1015.0 |  | 4942828663.665 |
| 1016.0 |  | 276775153.214 |
| 1017.0 |  | 109752337.97 |
| 1018.0 |  | 2502566346.834 |
| 1019.0 |  | 3673527362.972 |
| 1020.0 |  | 938008847.105 |
| 1021.0 |  | 137592905.751 |
| 1022.0 |  | 3041999470.643 |
| 1023.0 |  | 728489357.625 |
| 1024.0 |  | 655460826.045 |
| 1025.0 |  | 1162833042.636 |
| 1026.0 |  | 212889462.609 |
| 1027.0 |  | 417431823.781 |
| 1028.0 |  | 749964559.143 |
| 1029.0 |  | 568662020.549 |
| 1030.0 |  | 6722809307.473 |
| 1031.0 |  | 844382550.505 |
| 1032.0 |  | 264865595.863 |
| 1033.0 |  | 1586355885.335 |
| 1034.0 |  | 193128904.081 |
| 1035.0 |  | 2836923299.833 |
| 1036.0 |  | 718542458.212 |
| 1037.0 |  | 1538372855.569 |
| 1038.0 |  | 846440223.083 |
| 1039.0 |  | 195635921.363 |
| 1040.0 |  | 2717730114.428 |
| 1041.0 |  | 269345125.363 |
| 1042.0 |  | 608415258.364 |
| 1043.0 |  | 2659218588.809 |
| 1044.0 |  | 1693605858.065 |
| 1045.0 |  | 791131808.911 |
| 1046.0 |  | 1686161626.601 |
| 1047.0 |  | 760049987.36 |
| 1048.0 |  | 478331060.567 |
| 1049.0 |  | 1789309901.01 |
| 1050.0 |  | 269285277.503 |
| 1051.0 |  | 1215381631.843 |
| 1052.0 |  | 1209428752.913 |
| 1053.0 |  | 3472924669.858 |
| 1054.0 |  | 171692888.73 |
| 1055.0 |  | 2931133994.357 |
| 1056.0 |  | 6048684050.051 |
| 1057.0 |  | 3788183339.847 |
| 1058.0 |  | 2793509334.883 |
| 1059.0 |  | 1160697547.908 |
| 1060.0 |  | 776001868.987 |
| 1061.0 |  | 978174316.673 |
| 1062.0 |  | 441778129.55 |
| 1063.0 |  | 113238892.094 |
| 1064.0 |  | 405828607.58 |
| 1065.0 |  | 996268500.011 |
| 1066.0 |  | 790169725.233 |
| 1067.0 |  | 3310614038.459 |
| 1068.0 |  | 1023543077.991 |
| 1069.0 |  | 2827485040.373 |
| 1070.0 |  | 943525074.361 |
| 1071.0 |  | 681222993.606 |
| 1072.0 |  | 1622938179.135 |
| 1073.0 |  | 268130223.573 |
| 1074.0 |  | 216725263.19 |
| 1075.0 |  | 613737974.754 |
| 1076.0 |  | 121093817.552 |
| 1077.0 |  | 370808790.056 |
| 1078.0 |  | 3033225815.225 |
| 1079.0 |  | 87630559.363 |
| 1080.0 |  | 2231774675.666 |
| 1081.0 |  | 1012571030.62 |
| 1082.0 |  | 1152160596.572 |
| 1083.0 |  | 413480987.854 |
| 1084.0 |  | 2999766043.173 |
| 1085.0 |  | 727413312.752 |
| 1086.0 |  | 3729844504.448 |
| 1087.0 |  | 711771062.105 |
| 1088.0 |  | 2302844134.459 |
| 1089.0 |  | 760632628.169 |
| 1090.0 |  | 435213340.571 |
| 1091.0 |  | 2227620618.037 |
| 1092.0 |  | 1534765893.806 |
| 1093.0 |  | 6598024858.617 |
| 1094.0 |  | 1852963434.143 |
| 1095.0 |  | 85921772.607 |
| 1096.0 |  | 738805851.426 |
| 1097.0 |  | 659176073.09 |
| 1098.0 |  | 4423826103.78 |
| 1099.0 |  | 848350540.385 |
| 1100.0 |  | 1737329549.505 |
| 1101.0 |  | 2286092275.9 |
| 1102.0 |  | 1364209860.608 |
| 1103.0 |  | 1678894626.508 |
| 1104.0 |  | 804998881.809 |
| 1105.0 |  | 719441778.881 |
| 1106.0 |  | 1077682235.098 |
| 1107.0 |  | 624640276.327 |
| 1108.0 |  | 1488887643.615 |
| 1109.0 |  | 1800440930.634 |
| 1110.0 |  | 1589742899.08 |
| 1111.0 |  | 954620812.95 |
| 1112.0 |  | 429809416.445 |
| 1113.0 |  | 407396906.438 |
| 1114.0 |  | 359275122.804 |
| 1115.0 |  | 1561900762.832 |
| 1116.0 |  | 2285139480.175 |
| 1117.0 |  | 770750257.463 |
| 1118.0 |  | 1941031035.905 |
| 1119.0 |  | 177732832.303 |
| 1120.0 |  | 1660435911.939 |
| 1121.0 |  | 1888920446.325 |
| 1122.0 |  | 2531150889.138 |
| 1123.0 |  | 2352235721.3 |
| 1124.0 |  | 3051620179.728 |
| 1125.0 |  | 1377989290.089 |
| 1126.0 |  | 3042104010.069 |
| 1127.0 |  | 3024532256.54 |
| 1128.0 |  | 977011427.979 |
| 1129.0 |  | 861324000.032 |
| 1130.0 |  | 1063387752.868 |
| 1131.0 |  | 281015419.498 |
| 1132.0 |  | 2667815802.674 |
| 1133.0 |  | 413682383.559 |
| 1134.0 |  | 915842994.686 |
| 1135.0 |  | 753430191.335 |
| 1136.0 |  | 818447503.132 |
| 1137.0 |  | 1485526227.596 |
| 1138.0 |  | 278192030.389 |
| 1139.0 |  | 1273780989.731 |
| 1140.0 |  | 3279451376.16 |
| 1141.0 |  | 1008085778.906 |
| 1142.0 |  | 1110324513.746 |
| 1143.0 |  | 724198129.741 |
| 1144.0 |  | 642470724.231 |
| 1145.0 |  | 923497327.852 |
| 1146.0 |  | 674584545.337 |
| 1147.0 |  | 866846481.045 |
| 1148.0 |  | 2567865864.164 |
| 1149.0 |  | 534491948.653 |
| 1150.0 |  | 2473009755.97 |
| 1151.0 |  | 712488334.265 |
| 1152.0 |  | 1974213382.062 |
| 1153.0 |  | 1626348514.9 |
| 1154.0 |  | 3095923664.101 |
| 1155.0 |  | 425110440.748 |
| 1156.0 |  | 1726964848.319 |
| 1157.0 |  | 330258056.952 |
| 1158.0 |  | 1271720859.717 |
| 1159.0 |  | 537455985.81 |
| 1160.0 |  | 936697006.515 |
| 1161.0 |  | 199871871.779 |
| 1162.0 |  | 1453907847.447 |
| 1163.0 |  | 3378277786.737 |
| 1164.0 |  | 1195249930.855 |
| 1165.0 |  | 1651568112.356 |
| 1166.0 |  | 477155642.617 |
| 1167.0 |  | 3099121943.334 |
| 1168.0 |  | 2432418691.118 |
| 1169.0 |  | 340629520.557 |
| 1170.0 |  | 979679293.113 |
| 1171.0 |  | 840283497.903 |
| 1172.0 |  | 2123408054.826 |
| 1173.0 |  | 910771762.716 |
| 1174.0 |  | 1793868152.556 |
| 1175.0 |  | 235898328.048 |
| 1176.0 |  | 660007359.018 |
| 1177.0 |  | 377553481.025 |
| 1178.0 |  | 2330020932.333 |
| 1179.0 |  | 1857172772.87 |
| 1180.0 |  | 2470856858.86 |
| 1181.0 |  | 345904297.544 |
| 1182.0 |  | 3960167659.89 |
| 1183.0 |  | 297620697.325 |
| 1184.0 |  | 608305334.349 |
| 1185.0 |  | 786145837.063 |
| 1186.0 |  | 265237528.832 |
| 1187.0 |  | 461492325.135 |
| 1188.0 |  | 2054142236.393 |
| 1189.0 |  | 2461891957.937 |
| 1190.0 |  | 508336079.09 |
| 1191.0 |  | 1431816150.515 |
| 1192.0 |  | 217144651.631 |
| 1193.0 |  | 1637056592.817 |
| 1194.0 |  | 82149477.231 |
| 1195.0 |  | 1011072227.816 |
| 1196.0 |  | 637980832.281 |
| 1197.0 |  | 424267378.059 |
| 1198.0 |  | 4037027581.125 |
| 1199.0 |  | 464426133.19 |
| 1200.0 |  | 559521942.378 |
| 1201.0 |  | 943846021.525 |
| 1202.0 |  | 2270627627.872 |
| 1203.0 |  | 3299747538.196 |
| 1204.0 |  | 350241018.201 |
| 1205.0 |  | 184414453.014 |
| 1206.0 |  | 3008320184.217 |
| 1207.0 |  | 3712267909.207 |
| 1208.0 |  | 1298837647.82 |
| 1209.0 |  | 4490267072.492 |
| 1210.0 |  | 1289517304.572 |
| 1211.0 |  | 369273948.687 |
| 1212.0 |  | 1067115256.59 |
| 1213.0 |  | 1195008931.565 |
| 1214.0 |  | 824980034.77 |
| 1215.0 |  | 919709534.472 |
| 1216.0 |  | 1031929996.431 |
| 1217.0 |  | 1306862865.258 |
| 1218.0 |  | 2909579930.298 |
| 1219.0 |  | 353572852.456 |
| 1220.0 |  | 1612670569.449 |
| 1221.0 |  | 197366352.612 |
| 1222.0 |  | 2284314391.058 |
| 1223.0 |  | 2391058334.93 |
| 1224.0 |  | 1265353316.052 |
| 1225.0 |  | 691315174.498 |
| 1226.0 |  | 1759358980.576 |
| 1227.0 |  | 190013150.083 |
| 1228.0 |  | 878687635.974 |
| 1229.0 |  | 1642945202.905 |
| 1230.0 |  | 391832065.767 |
| 1231.0 |  | 750305155.294 |
| 1232.0 |  | 579850391.29 |
| 1233.0 |  | 2864607115.59 |
| 1234.0 |  | 464624685.271 |
| 1235.0 |  | 1155270190.008 |
| 1236.0 |  | 2168281719.663 |
| 1237.0 |  | 1112326850.525 |
| 1238.0 |  | 1275253658.611 |
| 1239.0 |  | 2580440346.903 |
| 1240.0 |  | 906434981.1 |
| 1241.0 |  | 822694676.176 |
| 1242.0 |  | 446595086.42 |
| 1243.0 |  | 378227626.183 |
| 1244.0 |  | 1069344656.849 |
| 1245.0 |  | 198146072.059 |
| 1246.0 |  | 3410251695.215 |
| 1247.0 |  | 415534245.236 |
| 1248.0 |  | 103921660.26 |
| 1249.0 |  | 2895856658.497 |
| 1250.0 |  | 2332979946.513 |
| 1251.0 |  | 559323139.381 |
| 1252.0 |  | 494879584.896 |
| 1253.0 |  | 1047997336.245 |
| 1254.0 |  | 409443218.64 |
| 1255.0 |  | 267380370.317 |
| 1256.0 |  | 319684774.073 |
| 1257.0 |  | 1774909527.312 |
| 1258.0 |  | 1685977355.275 |
| 1259.0 |  | 645465621.534 |
| 1260.0 |  | 1642437216.431 |
| 1261.0 |  | 750595747.4 |
| 1262.0 |  | 2543067091.797 |
| 1263.0 |  | 3299044299.288 |
| 1264.0 |  | 2157631411.949 |
| 1265.0 |  | 2247682149.112 |
| 1266.0 |  | 417161542.579 |
| 1267.0 |  | 2113436017.443 |
| 1268.0 |  | 2342987978.932 |
| 1269.0 |  | 325373558.997 |
| 1270.0 |  | 1346499899.745 |
| 1271.0 |  | 2261813406.402 |
| 1272.0 |  | 275648510.078 |
| 1273.0 |  | 2410743922.994 |
| 1274.0 |  | 295462626.686 |
| 1275.0 |  | 2467929640.393 |
| 1276.0 |  | 974179318.601 |
| 1277.0 |  | 2824087028.233 |
| 1278.0 |  | 882524996.781 |
| 1279.0 |  | 3396992384.349 |
| 1280.0 |  | 3775406180.265 |
| 1281.0 |  | 1619576671.412 |
| 1282.0 |  | 150842782.253 |
| 1283.0 |  | 809705833.129 |
| 1284.0 |  | 1957820330.128 |
| 1285.0 |  | 413013175.314 |
| 1286.0 |  | 902709173.368 |
| 1287.0 |  | 2687460722.551 |
| 1288.0 |  | 3039022257.619 |
| 1289.0 |  | 1661255544.027 |
| 1290.0 |  | 172194027.823 |
| 1291.0 |  | 1085262503.247 |
| 1292.0 |  | 1322428225.592 |
| 1293.0 |  | 2288324182.678 |
| 1294.0 |  | 2845294066.269 |
| 1295.0 |  | 584013791.591 |
| 1296.0 |  | 233495243.146 |
| 1297.0 |  | 572021030.012 |
| 1298.0 |  | 5205352893.369 |
| 1299.0 |  | 195796755.01 |
| 1300.0 |  | 504549452.695 |
| 1301.0 |  | 2639794709.265 |
| 1302.0 |  | 4723442287.19 |
| 1303.0 |  | 165797823.451 |
| 1304.0 |  | 429190607.424 |
| 1305.0 |  | 2123658009.089 |
| 1306.0 |  | 1933133096.562 |
| 1307.0 |  | 2569521687.433 |
| 1308.0 |  | 1630686237.097 |
| 1309.0 |  | 2121323195.771 |
| 1310.0 |  | 727058087.386 |
| 1311.0 |  | 2158518756.263 |
| 1312.0 |  | 282311597.697 |
| 1313.0 |  | 2880458715.114 |
| 1314.0 |  | 360973253.82 |
| 1315.0 |  | 1543729359.984 |
| 1316.0 |  | 2687161403.167 |
| 1317.0 |  | 553596775.899 |
| 1318.0 |  | 217706865.232 |
| 1319.0 |  | 729829562.92 |
| 1320.0 |  | 297329027.911 |
| 1321.0 |  | 183422988.943 |
| 1322.0 |  | 341075812.822 |
| 1323.0 |  | 601365130.532 |
| 1324.0 |  | 3073577217.704 |
| 1325.0 |  | 361276232.914 |
| 1326.0 |  | 1157241004.86 |
| 1327.0 |  | 625370550.165 |
| 1328.0 |  | 7734740809.189 |
| 1329.0 |  | 433928363.514 |
| 1330.0 |  | 428994952.666 |
| 1331.0 |  | 495911188.339 |
| 1332.0 |  | 2234203552.626 |
| 1333.0 |  | 524517668.801 |
| 1334.0 |  | 824579205.954 |
| 1335.0 |  | 265853888.866 |
| 1336.0 |  | 816176732.065 |
| 1337.0 |  | 3421335350.893 |
| 1338.0 |  | 1458343460.142 |
| 1339.0 |  | 869093923.422 |
| 1340.0 |  | 817623646.379 |
| 1341.0 |  | 749515722.237 |
| 1342.0 |  | 566099199.274 |
| 1343.0 |  | 465617604.175 |
| 1344.0 |  | 1365511895.662 |
| 1345.0 |  | 149751950.137 |
| 1346.0 |  | 2221511886.082 |
| 1347.0 |  | 554810025.96 |
| 1348.0 |  | 471646050.898 |
| 1349.0 |  | 1272864510.762 |
| 1350.0 |  | 3506954827.787 |
| 1351.0 |  | 3363782964.446 |
| 1352.0 |  | 932453554.135 |
| 1353.0 |  | 3124898077.952 |
| 1354.0 |  | 888940695.905 |
| 1355.0 |  | 1280321985.895 |
| 1356.0 |  | 3471082812.998 |
| 1357.0 |  | 146877633.776 |
| 1358.0 |  | 2081160063.87 |
| 1359.0 |  | 465854295.399 |
| 1360.0 |  | 182961331.72 |
| 1361.0 |  | 613005852.37 |
| 1362.0 |  | 1651495877.663 |
| 1363.0 |  | 397140090.487 |
| 1364.0 |  | 2431223528.266 |
| 1365.0 |  | 1157665910.266 |
| 1366.0 |  | 373878314.477 |
| 1367.0 |  | 1325467476.049 |
| 1368.0 |  | 567547106.789 |
| 1369.0 |  | 424971353.066 |
| 1370.0 |  | 284085269.787 |
| 1371.0 |  | 1456881352.288 |
| 1372.0 |  | 1907453346.122 |
| 1373.0 |  | 1510269374.078 |
| 1374.0 |  | 3612274134.912 |
| 1375.0 |  | 1015542216.984 |
| 1376.0 |  | 251637614.632 |
| 1377.0 |  | 3972772586.006 |
| 1378.0 |  | 674911589.143 |
| 1379.0 |  | 678849371.878 |
| 1380.0 |  | 680246226.886 |
| 1381.0 |  | 1859153006.763 |
| 1382.0 |  | 363632200.082 |
| 1383.0 |  | 1081402874.256 |
| 1384.0 |  | 3947714892.566 |
| 1385.0 |  | 424111322.14 |
| 1386.0 |  | 686203818.043 |
| 1387.0 |  | 796311211.128 |
| 1388.0 |  | 411662482.03 |
| 1389.0 |  | 1478191212.755 |
| 1390.0 |  | 765078263.938 |
| 1391.0 |  | 396444405.769 |
| 1392.0 |  | 531933722.966 |
| 1393.0 |  | 1192505571.583 |
| 1394.0 |  | 708837573.612 |
| 1395.0 |  | 1685252491.504 |
| 1396.0 |  | 555780369.628 |
| 1397.0 |  | 267014702.885 |
| 1398.0 |  | 880352782.413 |
| 1399.0 |  | 1146031099.781 |
| 1400.0 |  | 542827024.051 |
| 1401.0 |  | 515752172.844 |
| 1402.0 |  | 2762962799.842 |
| 1403.0 |  | 3345967268.044 |
| 1404.0 |  | 913022052.478 |
| 1405.0 |  | 1516348965.008 |
| 1406.0 |  | 46263009.896 |
| 1407.0 |  | 2160706412.393 |
| 1408.0 |  | 1421942268.064 |
| 1409.0 |  | 2321012988.501 |
| 1410.0 |  | 3516631216.775 |
| 1411.0 |  | 1917243195.035 |
| 1412.0 |  | 444373316.944 |
| 1413.0 |  | 177887839.883 |
| 1414.0 |  | 1230535025.271 |
| 1415.0 |  | 509635787.43 |
| 1416.0 |  | 709118138.142 |
| 1417.0 |  | 757689600.381 |
| 1418.0 |  | 1189576616.058 |
| 1419.0 |  | 250243430.976 |
| 1420.0 |  | 3534460493.393 |
| 1421.0 |  | 887338269.074 |
| 1422.0 |  | 584737022.59 |
| 1423.0 |  | 1126083261.507 |
| 1424.0 |  | 1066023371.073 |
| 1425.0 |  | 897247725.054 |
| 1426.0 |  | 1709926534.343 |
| 1427.0 |  | 546214022.266 |
| 1428.0 |  | 4431682148.025 |
| 1429.0 |  | 112122275.426 |
| 1430.0 |  | 4178786371.927 |
| 1431.0 |  | 2437629703.635 |
| 1432.0 |  | 2020292694.349 |
| 1433.0 |  | 159730921.395 |
| 1434.0 |  | 1786640677.086 |
| 1435.0 |  | 747846911.685 |
| 1436.0 |  | 2686209783.416 |
| 1437.0 |  | 2242513730.78 |
| 1438.0 |  | 569282085.267 |
| 1439.0 |  | 899587855.176 |
| 1440.0 |  | 613561942.728 |
| 1441.0 |  | 2433392931.021 |
| 1442.0 |  | 4609582392.892 |
| 1443.0 |  | 1164371440.837 |
| 1444.0 |  | 582823303.72 |
| 1445.0 |  | 1052137940.41 |
| 1446.0 |  | 1046341813.686 |
| 1447.0 |  | 691824789.881 |
| 1448.0 |  | 371496486.547 |
| 1449.0 |  | 1108985394.923 |
| 1450.0 |  | 726570377.259 |
| 1451.0 |  | 854716898.356 |
| 1452.0 |  | 8547596693.332 |
| 1453.0 |  | 2138142613.498 |
| 1454.0 |  | 1010566482.155 |
| 1455.0 |  | 462526740.93 |
| 1456.0 |  | 2606813053.416 |
| 1457.0 |  | 148013288.252 |
| 1458.0 |  | 2367941059.165 |
| 1459.0 |  | 435513374.042 |
| 1460.0 |  | 368103306.842 |
| 1461.0 |  | 1004386640.286 |
| 1462.0 |  | 665591352.431 |
| 1463.0 |  | 3199667735.402 |
| 1464.0 |  | 712422303.992 |
| 1465.0 |  | 298080982.268 |
| 1466.0 |  | 467539377.848 |
| 1467.0 |  | 521117642.777 |
| 1468.0 |  | 1896551708.462 |
| 1469.0 |  | 1758025362.77 |
| 1470.0 |  | 2885918353.43 |
| 1471.0 |  | 959292551.978 |
| 1472.0 |  | 276819745.275 |
| 1473.0 |  | 604728936.161 |
| 1474.0 |  | 459048708.671 |
| 1475.0 |  | 3189563349.248 |
| 1476.0 |  | 757847460.706 |
| 1477.0 |  | 803500440.886 |
| 1478.0 |  | 197065293.631 |
| 1479.0 |  | 764981334.754 |
| 1480.0 |  | 1383280542.13 |
| 1481.0 |  | 455917352.179 |
| 1482.0 |  | 484864053.2 |
| 1483.0 |  | 574069361.495 |
| 1484.0 |  | 218136183.152 |
| 1485.0 |  | 144159348.996 |
| 1486.0 |  | 263403932.582 |
| 1487.0 |  | 998783188.43 |
| 1488.0 |  | 686368575.43 |
| 1489.0 |  | 731217845.301 |
| 1490.0 |  | 331883975.677 |
| 1491.0 |  | 2235471403.437 |
| 1492.0 |  | 409019196.194 |
| 1493.0 |  | 856149122.006 |
| 1494.0 |  | 842261999.458 |
| 1495.0 |  | 772073461.286 |
| 1496.0 |  | 966595814.204 |
| 1497.0 |  | 236610693.57 |
| 1498.0 |  | 4936699347.469 |
| 1499.0 |  | 3263708741.245 |
| 1500.0 |  | 712400423.189 |
| 1501.0 |  | 1677716026.215 |
| 1502.0 |  | 1505451601.525 |
| 1503.0 |  | 683677606.217 |
| 1504.0 |  | 3447288371.241 |
| 1505.0 |  | 858164597.631 |
| 1506.0 |  | 2429738648.278 |
| 1507.0 |  | 1204588947.164 |
| 1508.0 |  | 2104787120.175 |
| 1509.0 |  | 750293087.375 |
| 1510.0 |  | 671749744.315 |
| 1511.0 |  | 789835203.419 |
| 1512.0 |  | 1248125846.584 |
| 1513.0 |  | 2751805406.033 |
| 1514.0 |  | 2552852264.325 |
| 1515.0 |  | 3429014944.386 |
| 1516.0 |  | 882277798.363 |
| 1517.0 |  | 1485775856.09 |
| 1518.0 |  | 511646885.709 |
| 1519.0 |  | 718943000.426 |
| 1520.0 |  | 1350082259.1 |
| 1521.0 |  | 6904152492.21 |
| 1522.0 |  | 1375793614.428 |
| 1523.0 |  | 667933938.903 |
| 1524.0 |  | 4444850300.821 |
| 1525.0 |  | 621712491.646 |
| 1526.0 |  | 491338025.612 |
| 1527.0 |  | 3002389579.792 |
| 1528.0 |  | 3368945367.137 |
| 1529.0 |  | 464547355.086 |
| 1530.0 |  | 232166160.625 |
| 1531.0 |  | 256337078.323 |
| 1532.0 |  | 1218758259.305 |
| 1533.0 |  | 329467369.322 |
| 1534.0 |  | 326439038.545 |
| 1535.0 |  | 2131078249.037 |
| 1536.0 |  | 379992022.33 |
| 1537.0 |  | 1532479043.989 |
| 1538.0 |  | 2429287576.213 |
| 1539.0 |  | 986641318.166 |
| 1540.0 |  | 1067461965.886 |
| 1541.0 |  | 505309342.563 |
| 1542.0 |  | 1516965292.67 |
| 1543.0 |  | 604746139.284 |
| 1544.0 |  | 602683854.039 |
| 1545.0 |  | 177791526.136 |
| 1546.0 |  | 451672130.119 |
| 1547.0 |  | 449772220.238 |
| 1548.0 |  | 3083676140.525 |
| 1549.0 |  | 785848730.256 |
| 1550.0 |  | 1556487967.896 |
| 1551.0 |  | 532987226.76 |
| 1552.0 |  | 871077298.931 |
| 1553.0 |  | 83920870.615 |
| 1554.0 |  | 1054976024.487 |
| 1555.0 |  | 2663835480.173 |
| 1556.0 |  | 1805798439.612 |
| 1557.0 |  | 2478032682.89 |
| 1558.0 |  | 781639966.846 |
| 1559.0 |  | 341588836.947 |
| 1560.0 |  | 1984203543.421 |
| 1561.0 |  | 182121046.438 |
| 1562.0 |  | 240539114.072 |
| 1563.0 |  | 3247637955.925 |
| 1564.0 |  | 618442908.971 |
| 1565.0 |  | 2755972198.444 |
| 1566.0 |  | 379051247.165 |
| 1567.0 |  | 2167568571.854 |
| 1568.0 |  | 236562775.775 |
| 1569.0 |  | 1913779650.027 |
| 1570.0 |  | 2231928364.903 |
| 1571.0 |  | 3438798469.286 |
| 1572.0 |  | 670801665.783 |
| 1573.0 |  | 2426937173.672 |
| 1574.0 |  | 1699616641.483 |
| 1575.0 |  | 627190551.831 |
| 1576.0 |  | 1604091687.081 |
| 1577.0 |  | 2545734006.745 |
| 1578.0 |  | 793790707.224 |
| 1579.0 |  | 1892996136.267 |
| 1580.0 |  | 306356910.993 |
| 1581.0 |  | 743410367.4 |
| 1582.0 |  | 223994144.938 |
| 1583.0 |  | 234785593.311 |
| 1584.0 |  | 3636242685.767 |
| 1585.0 |  | 1211352001.508 |
| 1586.0 |  | 581656526.673 |
| 1587.0 |  | 1316069206.146 |
| 1588.0 |  | 4365685147.465 |
| 1589.0 |  | 879390770.746 |
| 1590.0 |  | 319762314.601 |
| 1591.0 |  | 363020901.582 |
| 1592.0 |  | 397204313.209 |
| 1593.0 |  | 471066484.731 |
| 1594.0 |  | 2213600167.144 |
| 1595.0 |  | 2227191213.786 |
| 1596.0 |  | 1237863064.649 |
| 1597.0 |  | 2988523204.395 |
| 1598.0 |  | 1325055043.432 |
| 1599.0 |  | 2210120867.016 |
| 1600.0 |  | 297544232.729 |
| 1601.0 |  | 776554599.81 |
| 1602.0 |  | 2490606432.261 |
| 1603.0 |  | 256398708.564 |
| 1604.0 |  | 1027200773.908 |
| 1605.0 |  | 1650045891.947 |
| 1606.0 |  | 303585058.392 |
| 1607.0 |  | 267334681.665 |
| 1608.0 |  | 245131176.489 |
| 1609.0 |  | 1107161359.464 |
| 1610.0 |  | 471511673.779 |
| 1611.0 |  | 329494049.877 |
| 1612.0 |  | 598499287.069 |
| 1613.0 |  | 2145299187.509 |
| 1614.0 |  | 1323820107.98 |
| 1615.0 |  | 2268142889.61 |
| 1616.0 |  | 651948544.494 |
| 1617.0 |  | 2972653201.26 |
| 1618.0 |  | 425007959.428 |
| 1619.0 |  | 670956113.544 |
| 1620.0 |  | 834009525.12 |
| 1621.0 |  | 521063132.1 |
| 1622.0 |  | 294771420.199 |
| 1623.0 |  | 2731364254.921 |
| 1624.0 |  | 557513948.227 |
| 1625.0 |  | 753274162.942 |
| 1626.0 |  | 821406500.762 |
| 1627.0 |  | 311102591.601 |
| 1628.0 |  | 567646979.738 |
| 1629.0 |  | 983154192.703 |
| 1630.0 |  | 815957676.327 |
| 1631.0 |  | 631934059.293 |
| 1632.0 |  | 436412871.006 |
| 1633.0 |  | 2176372800.344 |
| 1634.0 |  | 578910022.031 |
| 1635.0 |  | 735013797.449 |
| 1636.0 |  | 3392695835.235 |
| 1637.0 |  | 352544680.375 |
| 1638.0 |  | 1095117845.67 |
| 1639.0 |  | 247425586.614 |
| 1640.0 |  | 256202735.262 |
| 1641.0 |  | 2152519703.407 |
| 1642.0 |  | 3160836399.394 |
| 1643.0 |  | 946342130.517 |
| 1644.0 |  | 444244547.782 |
| 1645.0 |  | 1621495481.185 |
| 1646.0 |  | 1057243869.41 |
| 1647.0 |  | 247195943.833 |
| 1648.0 |  | 521730874.5 |
| 1649.0 |  | 5402633145.432 |
| 1650.0 |  | 1940091117.644 |
| 1651.0 |  | 2898736943.062 |
| 1652.0 |  | 714743242.482 |
| 1653.0 |  | 1886467872.425 |
| 1654.0 |  | 415100627.106 |
| 1655.0 |  | 2377614550.105 |
| 1656.0 |  | 2247411083.721 |
| 1657.0 |  | 379338881.491 |
| 1658.0 |  | 2266295865.424 |
| 1659.0 |  | 803390676.078 |
| 1660.0 |  | 439728812.129 |
| 1661.0 |  | 2318358707.215 |
| 1662.0 |  | 773958959.303 |
| 1663.0 |  | 419831144.734 |
| 1664.0 |  | 531286232.947 |
| 1665.0 |  | 3115553320.302 |
| 1666.0 |  | 1014341415.091 |
| 1667.0 |  | 221154833.381 |
| 1668.0 |  | 715471408.363 |
| 1669.0 |  | 1056866078.486 |
| 1670.0 |  | 3446469765.461 |
| 1671.0 |  | 1007945750.378 |
| 1672.0 |  | 418269268.165 |
| 1673.0 |  | 2665544247.841 |
| 1674.0 |  | 442063691.356 |
| 1675.0 |  | 628542234.545 |
| 1676.0 |  | 157662961.085 |
| 1677.0 |  | 2600894217.349 |
| 1678.0 |  | 3486214139.627 |
| 1679.0 |  | 3705336454.231 |
| 1680.0 |  | 1146162088.03 |
| 1681.0 |  | 888214426.544 |
| 1682.0 |  | 1431303248.698 |
| 1683.0 |  | 2787173113.655 |
| 1684.0 |  | 3089855593.219 |
| 1685.0 |  | 639264609.157 |
| 1686.0 |  | 997704934.485 |
| 1687.0 |  | 1105077298.946 |
| 1688.0 |  | 543700365.729 |
| 1689.0 |  | 879884335.483 |
| 1690.0 |  | 769639634.132 |
| 1691.0 |  | 282990605.884 |
| 1692.0 |  | 1739688810.217 |
| 1693.0 |  | 2518813849.118 |
| 1694.0 |  | 407573276.984 |
| 1695.0 |  | 2565096525.341 |
| 1696.0 |  | 1127419124.565 |
| 1697.0 |  | 2518042921.334 |
| 1698.0 |  | 1010646968.989 |
| 1699.0 |  | 760482563.643 |
| 1700.0 |  | 2683661455.733 |
| 1701.0 |  | 253451267.988 |
| 1702.0 |  | 1481612328.326 |
| 1703.0 |  | 890679644.949 |
| 1704.0 |  | 4843406936.1 |
| 1705.0 |  | 1440288276.036 |
| 1706.0 |  | 746294214.891 |
| 1707.0 |  | 985281694.995 |
| 1708.0 |  | 2286383121.5 |
| 1709.0 |  | 2239306573.766 |
| 1710.0 |  | 783707530.153 |
| 1711.0 |  | 3619628607.422 |
| 1712.0 |  | 406806958.871 |
| 1713.0 |  | 1494620735.69 |
| 1714.0 |  | 1935710744.145 |
| 1715.0 |  | 482508130.558 |
| 1716.0 |  | 638515159.819 |
| 1717.0 |  | 526432839.88 |
| 1718.0 |  | 182970917.495 |
| 1719.0 |  | 746426944.52 |
| 1720.0 |  | 379725180.161 |
| 1721.0 |  | 238918892.639 |
| 1722.0 |  | 456249366.877 |
| 1723.0 |  | 1042980638.75 |
| 1724.0 |  | 532310278.295 |
| 1725.0 |  | 890005828.294 |
| 1726.0 |  | 972554147.688 |
| 1727.0 |  | 2285512910.209 |
| 1728.0 |  | 312155082.937 |
| 1729.0 |  | 572575459.903 |
| 1730.0 |  | 5556478036.906 |
| 1731.0 |  | 391541842.111 |
| 1732.0 |  | 2485224525.85 |
| 1733.0 |  | 1039289693.255 |
| 1734.0 |  | 272395205.22 |
| 1735.0 |  | 415191263.571 |
| 1736.0 |  | 568316056.851 |
| 1737.0 |  | 2348248398.421 |
| 1738.0 |  | 999057091.778 |
| 1739.0 |  | 2928645839.981 |
| 1740.0 |  | 308881529.956 |
| 1741.0 |  | 1487251868.462 |
| 1742.0 |  | 943684104.323 |
| 1743.0 |  | 396335348.049 |
| 1744.0 |  | 2848762716.407 |
| 1745.0 |  | 646371729.901 |
| 1746.0 |  | 490289950.159 |
| 1747.0 |  | 936158223.801 |
| 1748.0 |  | 867930892.28 |
| 1749.0 |  | 465767964.648 |
| 1750.0 |  | 541879465.587 |
| 1751.0 |  | 415897575.869 |
| 1752.0 |  | 613200715.451 |
| 1753.0 |  | 304739873.969 |
| 1754.0 |  | 1265668414.712 |
| 1755.0 |  | 1051178590.684 |
| 1756.0 |  | 4121987636.203 |
| 1757.0 |  | 245557121.555 |
| 1758.0 |  | 3885362513.315 |
| 1759.0 |  | 632132382.041 |
| 1760.0 |  | 140724370.493 |
| 1761.0 |  | 44430995.635 |
| 1762.0 |  | 4140502377.797 |
| 1763.0 |  | 1535722934.175 |
| 1764.0 |  | 816457458.558 |
| 1765.0 |  | 3375857261.654 |
| 1766.0 |  | 1008364690.672 |
| 1767.0 |  | 603865289.353 |
| 1768.0 |  | 497610418.96 |
| 1769.0 |  | 2613108856.023 |
| 1770.0 |  | 426375177.35 |
| 1771.0 |  | 2079533567.779 |
| 1772.0 |  | 932081481.542 |
| 1773.0 |  | 151482581.412 |
| 1774.0 |  | 1757531788.238 |
| 1775.0 |  | 3525356399.526 |
| 1776.0 |  | 3483360049.122 |
| 1777.0 |  | 217255180.557 |
| 1778.0 |  | 891331202.599 |
| 1779.0 |  | 881792652.219 |
| 1780.0 |  | 1533355285.395 |
| 1781.0 |  | 1055423505.601 |
| 1782.0 |  | 2423037045.451 |
| 1783.0 |  | 267702898.539 |
| 1784.0 |  | 1120154746.164 |
| 1785.0 |  | 213946480.324 |
| 1786.0 |  | 874421682.626 |
| 1787.0 |  | 5023822976.379 |
| 1788.0 |  | 595206492.565 |
| 1789.0 |  | 515912881.288 |
| 1790.0 |  | 3121843152.251 |
| 1791.0 |  | 1567777873.087 |
| 1792.0 |  | 574877623.901 |
| 1793.0 |  | 892159146.98 |
| 1794.0 |  | 490174215.823 |
| 1795.0 |  | 186969081.436 |
| 1796.0 |  | 901296437.164 |
| 1797.0 |  | 595193156.356 |
| 1798.0 |  | 878207201.286 |
| 1799.0 |  | 442605779.82 |
| 1800.0 |  | 836063551.614 |
| 1801.0 |  | 589970920.615 |
| 1802.0 |  | 2987580486.631 |
| 1803.0 |  | 3233685068.788 |
| 1804.0 |  | 630923427.438 |
| 1805.0 |  | 446237826.071 |
| 1806.0 |  | 4243234142.852 |
| 1807.0 |  | 2721445301.34 |
| 1808.0 |  | 1812167571.292 |
| 1809.0 |  | 3248665640.058 |
| 1810.0 |  | 337434224.862 |
| 1811.0 |  | 2714429569.422 |
| 1812.0 |  | 560945943.847 |
| 1813.0 |  | 529970566.036 |
| 1814.0 |  | 219892351.782 |
| 1815.0 |  | 735995950.56 |
| 1816.0 |  | 3394264684.908 |
| 1817.0 |  | 518618436.42 |
| 1818.0 |  | 2015825706.978 |
| 1819.0 |  | 253034736.024 |
| 1820.0 |  | 479670615.759 |
| 1821.0 |  | 1218832472.523 |
| 1822.0 |  | 735953550.752 |
| 1823.0 |  | 868880458.981 |
| 1824.0 |  | 1436160735.74 |
| 1825.0 |  | 836624016.882 |
| 1826.0 |  | 939311849.584 |
| 1827.0 |  | 2197296455.537 |
| 1828.0 |  | 453841448.907 |
| 1829.0 |  | 2289459660.587 |
| 1830.0 |  | 1517845721.22 |
| 1831.0 |  | 672415310.702 |
| 1832.0 |  | 1121053534.811 |
| 1833.0 |  | 1062841091.08 |
| 1834.0 |  | 3279421757.728 |
| 1835.0 |  | 3971546409.066 |
| 1836.0 |  | 518397853.659 |
| 1837.0 |  | 1728816238.863 |
| 1838.0 |  | 2294995848.744 |
| 1839.0 |  | 1529582191.181 |
| 1840.0 |  | 1539391082.358 |
| 1841.0 |  | 271203171.99 |
| 1842.0 |  | 3060426557.332 |
| 1843.0 |  | 2524023427.786 |
| 1844.0 |  | 1613006766.442 |
| 1845.0 |  | 2518754797.684 |
| 1846.0 |  | 850648250.291 |
| 1847.0 |  | 1752516711.426 |
| 1848.0 |  | 369865073.749 |
| 1849.0 |  | 745496050.797 |
| 1850.0 |  | 2030256954.774 |
| 1851.0 |  | 2225753481.589 |
| 1852.0 |  | 423688408.012 |
| 1853.0 |  | 3814874770.415 |
| 1854.0 |  | 194467791.107 |
| 1855.0 |  | 997828567.008 |
| 1856.0 |  | 3379852881.575 |
| 1857.0 |  | 696988508.494 |
| 1858.0 |  | 1495398066.806 |
| 1859.0 |  | 1838388807.006 |
| 1860.0 |  | 4834757428.714 |
| 1861.0 |  | 1192304997.637 |
| 1862.0 |  | 1126925389.234 |
| 1863.0 |  | 2783120382.837 |
| 1864.0 |  | 2042964021.892 |
| 1865.0 |  | 709162735.758 |
| 1866.0 |  | 1442062836.592 |
| 1867.0 |  | 444163269.356 |
| 1868.0 |  | 1047672602.379 |
| 1869.0 |  | 1889987777.546 |
| 1870.0 |  | 728015248.867 |
| 1871.0 |  | 3151024341.514 |
| 1872.0 |  | 259312499.112 |
| 1873.0 |  | 514064291.133 |
| 1874.0 |  | 282323274.785 |
| 1875.0 |  | 383143565.707 |
| 1876.0 |  | 854058792.674 |
| 1877.0 |  | 66394185.059 |
| 1878.0 |  | 467521359.396 |
| 1879.0 |  | 210465591.149 |
| 1880.0 |  | 2363159995.85 |
| 1881.0 |  | 712631696.581 |
| 1882.0 |  | 488942231.961 |
| 1883.0 |  | 2895890662.926 |
| 1884.0 |  | 178744774.108 |
| 1885.0 |  | 2653757130.523 |
| 1886.0 |  | 7539518874.058 |
| 1887.0 |  | 1020455429.207 |
| 1888.0 |  | 2248003833.597 |
| 1889.0 |  | 1312396195.254 |
| 1890.0 |  | 1568635163.737 |
| 1891.0 |  | 762704005.973 |
| 1892.0 |  | 2386568203.338 |
| 1893.0 |  | 430044573.937 |
| 1894.0 |  | 1165250964.083 |
| 1895.0 |  | 723009565.381 |
| 1896.0 |  | 779092834.881 |
| 1897.0 |  | 859523017.829 |
| 1898.0 |  | 872447176.408 |
| 1899.0 |  | 1027135007.385 |
| 1900.0 |  | 2156805833.529 |
| 1901.0 |  | 247429640.693 |
| 1902.0 |  | 680433166.987 |
| 1903.0 |  | 2764912827.071 |
| 1904.0 |  | 2486319013.24 |
| 1905.0 |  | 998017553.193 |
| 1906.0 |  | 3768200477.762 |
| 1907.0 |  | 1758436416.546 |
| 1908.0 |  | 452511592.068 |
| 1909.0 |  | 560511700.629 |
| 1910.0 |  | 797434289.304 |
| 1911.0 |  | 357203812.625 |
| 1912.0 |  | 2412487022.736 |
| 1913.0 |  | 3143936019.047 |
| 1914.0 |  | 243362994.711 |
| 1915.0 |  | 935387822.428 |
| 1916.0 |  | 1989957886.375 |
| 1917.0 |  | 496598349.25 |
| 1918.0 |  | 847612457.092 |
| 1919.0 |  | 2933251067.512 |
| 1920.0 |  | 2992528579.028 |
| 1921.0 |  | 2065203755.981 |
| 1922.0 |  | 2564079173.551 |
| 1923.0 |  | 165118428.124 |
| 1924.0 |  | 1384559003.785 |
| 1925.0 |  | 237563264.301 |
| 1926.0 |  | 736152693.741 |
| 1927.0 |  | 448866493.141 |
| 1928.0 |  | 667041711.851 |
| 1929.0 |  | 2850889662.312 |
| 1930.0 |  | 1598870735.1 |
| 1931.0 |  | 2336099672.308 |
| 1932.0 |  | 1374016688.255 |
| 1933.0 |  | 258286237.341 |
| 1934.0 |  | 172556331.791 |
| 1935.0 |  | 3044849223.647 |
| 1936.0 |  | 414457602.926 |
| 1937.0 |  | 1364812947.179 |
| 1938.0 |  | 836514365.843 |
| 1939.0 |  | 3280102799.475 |
| 1940.0 |  | 444024722.441 |
| 1941.0 |  | 553467959.947 |
| 1942.0 |  | 1871947240.137 |
| 1943.0 |  | 2252721375.143 |
| 1944.0 |  | 1386146047.564 |
| 1945.0 |  | 871966602.587 |
| 1946.0 |  | 766195359.896 |
| 1947.0 |  | 925369308.812 |
| 1948.0 |  | 987883746.739 |
| 1949.0 |  | 2598505693.927 |
| 1950.0 |  | 952418966.53 |
| 1951.0 |  | 803731244.318 |
| 1952.0 |  | 2239819206.944 |
| 1953.0 |  | 2820950037.751 |
| 1954.0 |  | 1725438107.099 |
| 1955.0 |  | 302492650.504 |
| 1956.0 |  | 871786391.566 |
| 1957.0 |  | 548330341.739 |
| 1958.0 |  | 1586697841.736 |
| 1959.0 |  | 2364090383.344 |
| 1960.0 |  | 510637895.816 |
| 1961.0 |  | 4232457914.964 |
| 1962.0 |  | 274601778.496 |
| 1963.0 |  | 759077741.214 |
| 1964.0 |  | 1836866030.867 |
| 1965.0 |  | 1057477172.822 |
| 1966.0 |  | 752877188.103 |
| 1967.0 |  | 592308700.797 |
| 1968.0 |  | 442584974.197 |
| 1969.0 |  | 963766481.662 |
| 1970.0 |  | 622511416.498 |
| 1971.0 |  | 1589741019.141 |
| 1972.0 |  | 397906309.057 |
| 1973.0 |  | 3861338651.075 |
| 1974.0 |  | 1108385807.829 |
| 1975.0 |  | 462660227.455 |
| 1976.0 |  | 270395903.998 |
| 1977.0 |  | 3240001824.037 |
| 1978.0 |  | 1619240896.812 |
| 1979.0 |  | 3177265854.147 |
| 1980.0 |  | 2719657967.67 |
| 1981.0 |  | 4384045551.931 |
| 1982.0 |  | 1298562434.987 |
| 1983.0 |  | 3135888263.671 |
| 1984.0 |  | 2117593810.765 |
| 1985.0 |  | 849251714.001 |
| 1986.0 |  | 280636458.32 |
| 1987.0 |  | 1191968809.089 |
| 1988.0 |  | 350957272.442 |
| 1989.0 |  | 2308928028.166 |
| 1990.0 |  | 1826360340.913 |
| 1991.0 |  | 2725427113.007 |
| 1992.0 |  | 1360053908.721 |
| 1993.0 |  | 1176921027.524 |
| 1994.0 |  | 547920123.864 |
| 1995.0 |  | 3846464627.992 |
| 1996.0 |  | 2204213873.51 |
| 1997.0 |  | 720495697.674 |
| 1998.0 |  | 6171221887.628 |
| 1999.0 |  | 4759494645.172 |
| 2000.0 |  | 3962369059.942 |
| 2001.0 |  | 191003720.491 |
| 2002.0 |  | 1061587155.857 |
| 2003.0 |  | 352281610.839 |
| 2004.0 |  | 5856807277.076 |
| 2005.0 |  | 1989648713.766 |
| 2006.0 |  | 1492063577.671 |
| 2007.0 |  | 1083870623.641 |
| 2008.0 |  | 3438136379.295 |
| 2009.0 |  | 1914439482.655 |
| 2010.0 |  | 237322621.615 |
| 2011.0 |  | 901986924.403 |
| 2012.0 |  | 3849403419.86 |
| 2013.0 |  | 7534660596.125 |
| 2014.0 |  | 863390119.094 |
| 2015.0 |  | 1022589465.527 |
| 2016.0 |  | 772572972.716 |
| 2017.0 |  | 3564118989.905 |
| 2018.0 |  | 5235006157.556 |
| 2019.0 |  | 520167656.484 |
| 2020.0 |  | 3435507948.503 |
| 2021.0 |  | 619611384.086 |
| 2022.0 |  | 1223323584.546 |
| 2023.0 |  | 277572423.568 |
| 2024.0 |  | 1541827622.453 |
| 2025.0 |  | 905549014.68 |
| 2026.0 |  | 207015498.411 |
| 2027.0 |  | 1689956036.763 |
| 2028.0 |  | 3747941320.318 |
| 2029.0 |  | 775769399.002 |
| 2030.0 |  | 593439255.064 |
| 2031.0 |  | 924316015.868 |
| 2032.0 |  | 3476986464.916 |
| 2033.0 |  | 2088287086.726 |
| 2034.0 |  | 2206088736.248 |
| 2035.0 |  | 3679259274.069 |
| 2036.0 |  | 673996419.342 |
| 2037.0 |  | 3728057451.242 |
| 2038.0 |  | 3105789974.166 |
| 2039.0 |  | 376436974.818 |
| 2040.0 |  | 439788317.54 |
| 2041.0 |  | 2602265259.649 |
| 2042.0 |  | 2815935360.394 |
| 2043.0 |  | 1885968314.906 |
| 2044.0 |  | 429084650.743 |
| 2045.0 |  | 1675566829.457 |
| 2046.0 |  | 5006993316.201 |
| 2047.0 |  | 5521373614.192 |
| 2048.0 |  | 237314637.423 |
| 2049.0 |  | 4806840290.088 |
| 2050.0 |  | 1962949146.793 |
| 2051.0 |  | 1375785791.875 |
| 2052.0 |  | 2855886289.11 |
| 2053.0 |  | 1557942589.039 |
| 2054.0 |  | 973427024.592 |
| 2055.0 |  | 490400939.599 |
| 2056.0 |  | 564135001.858 |
| 2057.0 |  | 3307616888.626 |
| 2058.0 |  | 1419927732.259 |
| 2059.0 |  | 1058521503.304 |
| 2060.0 |  | 1224674493.964 |
| 2061.0 |  | 619252715.567 |
| 2062.0 |  | 668128930.676 |
| 2063.0 |  | 316494684.175 |
| 2064.0 |  | 2800700484.663 |
| 2065.0 |  | 1178620858.406 |
| 2066.0 |  | 556210829.042 |
| 2067.0 |  | 701937597.66 |
| 2068.0 |  | 1422668120.812 |
| 2069.0 |  | 1423937559.045 |
| 2070.0 |  | 4016264683.474 |
| 2071.0 |  | 643680279.275 |
| 2072.0 |  | 947854175.285 |
| 2073.0 |  | 1306962984.029 |
| 2074.0 |  | 366671355.805 |
| 2075.0 |  | 3422661607.462 |
| 2076.0 |  | 1745115163.767 |
| 2077.0 |  | 1366481192.764 |
| 2078.0 |  | 1073058148.486 |
| 2079.0 |  | 574496742.665 |
| 2080.0 |  | 1314016776.79 |
| 2081.0 |  | 2217010315.719 |
| 2082.0 |  | 2518572894.218 |
| 2083.0 |  | 744276106.412 |
| 2084.0 |  | 1334592409.74 |
| 2085.0 |  | 217415596.619 |
| 2086.0 |  | 274122432.147 |
| 2087.0 |  | 3510588211.904 |
| 2088.0 |  | 712437937.316 |
| 2089.0 |  | 481092886.512 |
| 2090.0 |  | 669909642.261 |
| 2091.0 |  | 1275635920.29 |
| 2092.0 |  | 1701916806.991 |
| 2093.0 |  | 1713349034.903 |
| 2094.0 |  | 361091669.691 |
| 2095.0 |  | 199129914.973 |
| 2096.0 |  | 1115628782.377 |
| 2097.0 |  | 677617834.681 |
| 2098.0 |  | 876944049.861 |
| 2099.0 |  | 392936118.623 |
| 2100.0 |  | 783133795.463 |
| 2101.0 |  | 3148703563.742 |
| 2102.0 |  | 290503708.976 |
| 2103.0 |  | 221666892.371 |
| 2104.0 |  | 2764961472.043 |
| 2105.0 |  | 377250155.091 |
| 2106.0 |  | 234778243.511 |
| 2107.0 |  | 464865545.71 |
| 2108.0 |  | 472459993.633 |
| 2109.0 |  | 113891293.467 |
| 2110.0 |  | 469082355.966 |
| 2111.0 |  | 1664944893.464 |
| 2112.0 |  | 1001891464.421 |
| 2113.0 |  | 457318645.652 |
| 2114.0 |  | 179999443.58 |
| 2115.0 |  | 1223756045.283 |
| 2116.0 |  | 965155549.598 |
| 2117.0 |  | 932643473.406 |
| 2118.0 |  | 1094154175.497 |
| 2119.0 |  | 4191996402.836 |
| 2120.0 |  | 1649243439.95 |
| 2121.0 |  | 1710337901.592 |
| 2122.0 |  | 1523350042.217 |
| 2123.0 |  | 1000306725.985 |
| 2124.0 |  | 2865438336.898 |
| 2125.0 |  | 391979119.463 |
| 2126.0 |  | 2728594552.379 |
| 2127.0 |  | 222365693.177 |
| 2128.0 |  | 895971825.521 |
| 2129.0 |  | 2899902440.907 |
| 2130.0 |  | 3634311722.289 |
| 2131.0 |  | 605189854.172 |
| 2132.0 |  | 1018796061.203 |
| 2133.0 |  | 3057634171.265 |
| 2134.0 |  | 1511518097.807 |
| 2135.0 |  | 2970463674.471 |
| 2136.0 |  | 1850203562.745 |
| 2137.0 |  | 4509467801.546 |
| 2138.0 |  | 1488737774.326 |
| 2139.0 |  | 2571585560.352 |
| 2140.0 |  | 1138407011.573 |
| 2141.0 |  | 3175880079.21 |
| 2142.0 |  | 2605682508.331 |
| 2143.0 |  | 882811086.736 |
| 2144.0 |  | 510461703.554 |
| 2145.0 |  | 1488567125.968 |